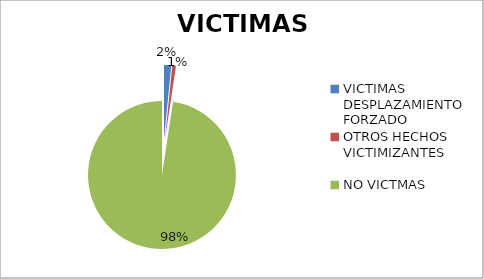
| Category | Series 0 | Series 1 |
|---|---|---|
| VICTIMAS DESPLAZAMIENTO FORZADO | 584 |  |
| OTROS HECHOS  VICTIMIZANTES  | 299 |  |
| NO VICTMAS  | 36214 |  |